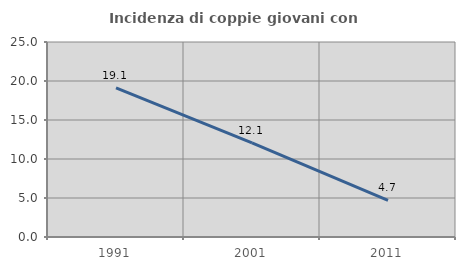
| Category | Incidenza di coppie giovani con figli |
|---|---|
| 1991.0 | 19.107 |
| 2001.0 | 12.055 |
| 2011.0 | 4.693 |